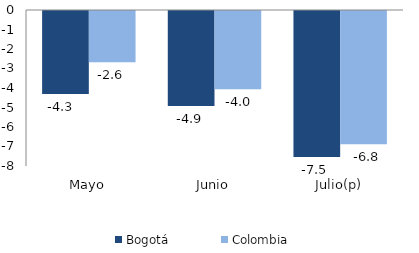
| Category | Bogotá | Colombia |
|---|---|---|
| Mayo | -4.26 | -2.632 |
| Junio | -4.873 | -4.017 |
| Julio(p) | -7.486 | -6.834 |